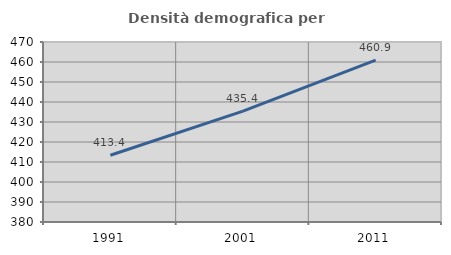
| Category | Densità demografica |
|---|---|
| 1991.0 | 413.366 |
| 2001.0 | 435.41 |
| 2011.0 | 460.921 |